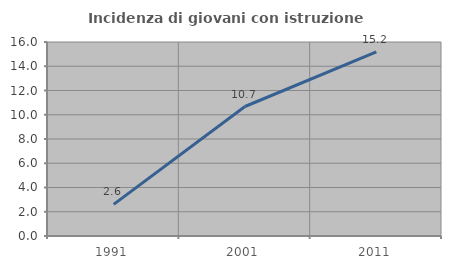
| Category | Incidenza di giovani con istruzione universitaria |
|---|---|
| 1991.0 | 2.609 |
| 2001.0 | 10.68 |
| 2011.0 | 15.179 |